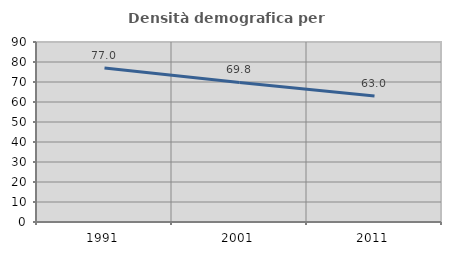
| Category | Densità demografica |
|---|---|
| 1991.0 | 76.985 |
| 2001.0 | 69.761 |
| 2011.0 | 63.05 |